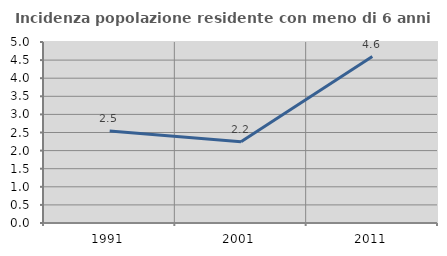
| Category | Incidenza popolazione residente con meno di 6 anni |
|---|---|
| 1991.0 | 2.542 |
| 2001.0 | 2.247 |
| 2011.0 | 4.598 |